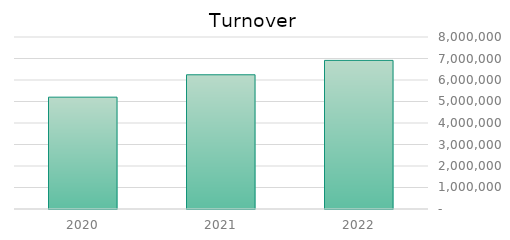
| Category | Turnover |
|---|---|
| 2022.0 | 6911623 |
| 2021.0 | 6242037 |
| 2020.0 | 5201696 |